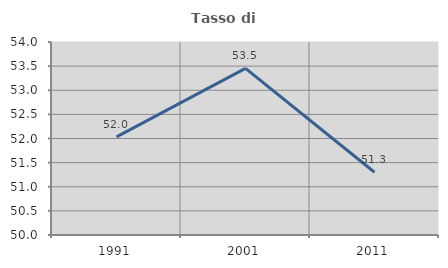
| Category | Tasso di occupazione   |
|---|---|
| 1991.0 | 52.035 |
| 2001.0 | 53.453 |
| 2011.0 | 51.3 |